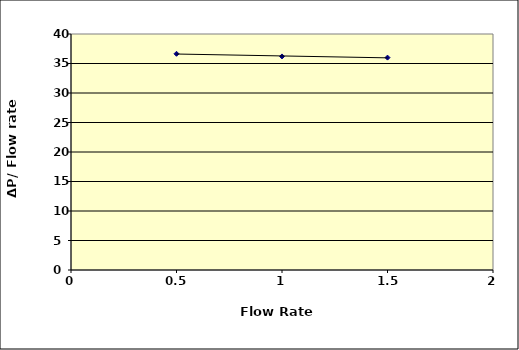
| Category | Series 0 |
|---|---|
| nan | 0 |
| 0.5 | 36.647 |
| 1.0 | 36.197 |
| 1.5 | 35.998 |